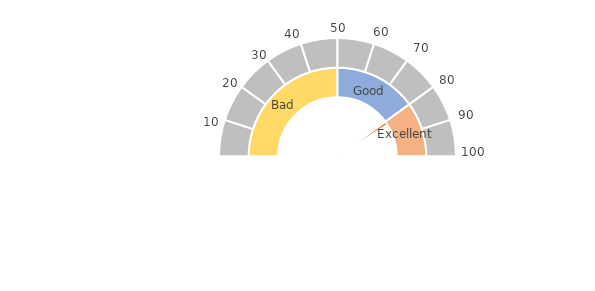
| Category | pie |
|---|---|
| 0 | 80 |
| 1 | 2 |
| 2 | 118 |